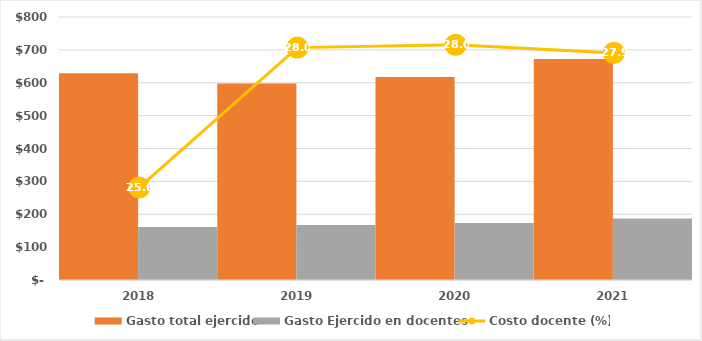
| Category | Gasto total ejercido | Gasto Ejercido en docentes |
|---|---|---|
| 2018 | 628799.563 | 160863.176 |
| 2019 | 598040.902 | 167308.478 |
| 2020 | 617347.742 | 173008.939 |
| 2021 | 672172.234 | 187436.524 |